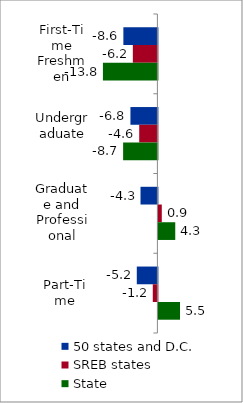
| Category | 50 states and D.C. | SREB states | State |
|---|---|---|---|
| First-Time Freshmen | -8.593 | -6.203 | -13.758 |
| Undergraduate | -6.809 | -4.594 | -8.658 |
| Graduate and Professional | -4.265 | 0.857 | 4.256 |
| Part-Time | -5.205 | -1.169 | 5.456 |